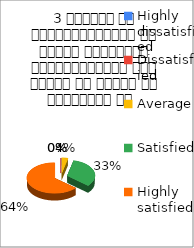
| Category | 3 शिक्षक का विद्यार्थियों के प्रति व्यव्हार मित्रतापूर्ण एवं सहयोग के भावना से परिपूर्ण था   |
|---|---|
| Highly dissatisfied | 0 |
| Dissatisfied | 0 |
| Average | 2 |
| Satisfied | 18 |
| Highly satisfied | 35 |